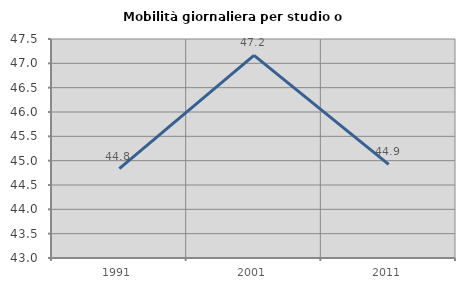
| Category | Mobilità giornaliera per studio o lavoro |
|---|---|
| 1991.0 | 44.836 |
| 2001.0 | 47.163 |
| 2011.0 | 44.925 |